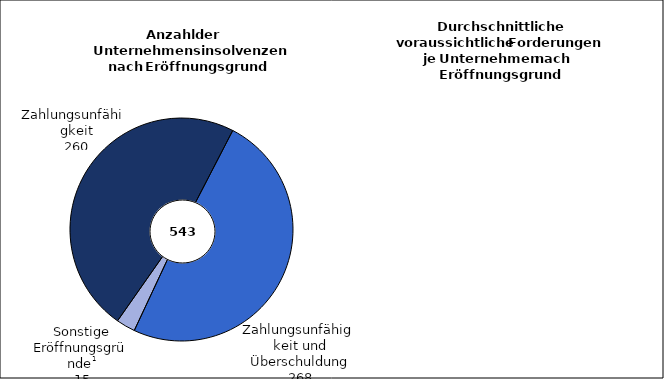
| Category | Series 0 | Series 1 |
|---|---|---|
| Zahlungsunfähigkeit | 260 | 271.223 |
|   Zahlungsunfähigkeit
   und Überschuldung | 268 | 1500.09 |
|  Sonstige Eröffnungs-
                      gründe 2 | 15 | 494.2 |